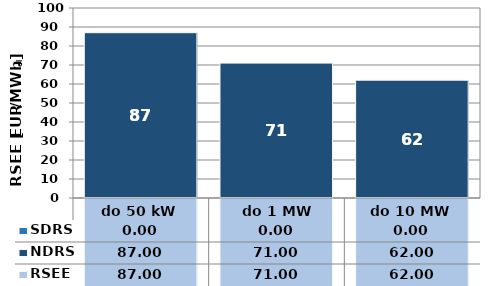
| Category | NDRS | SDRS |
|---|---|---|
| do 50 kW | 87 | 0 |
|  do 1 MW | 71 | 0 |
| do 10 MW | 62 | 0 |